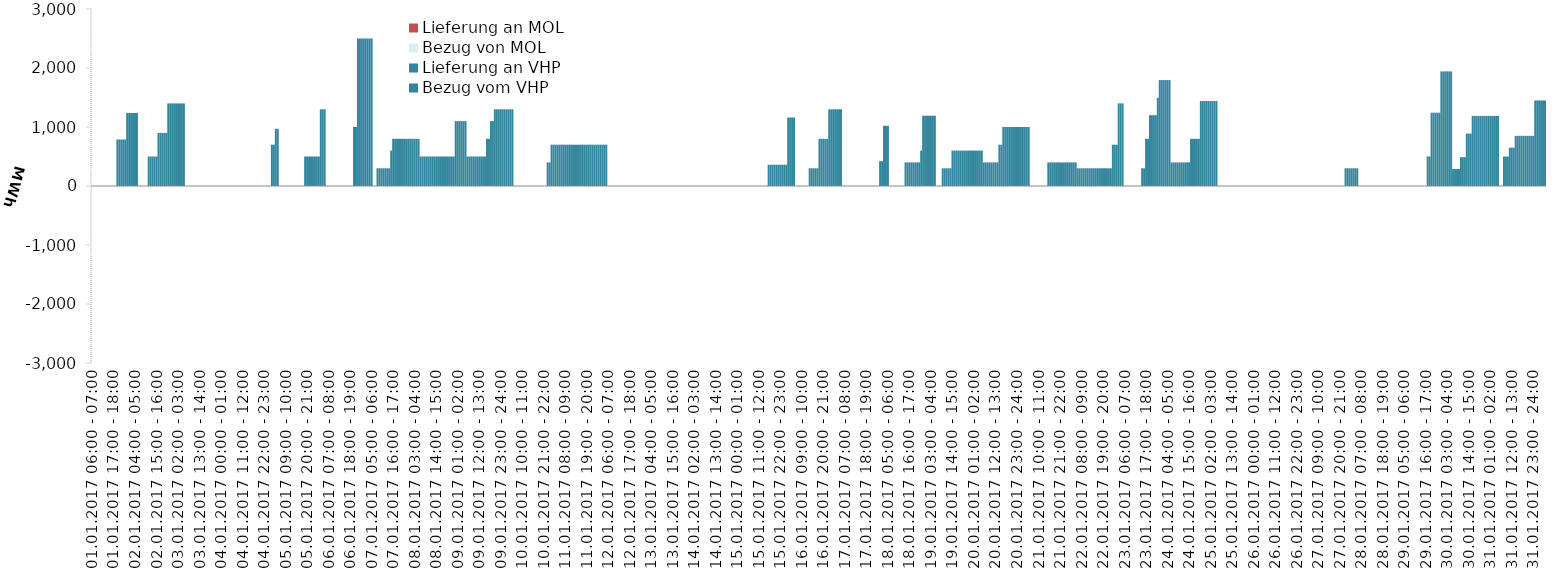
| Category | Bezug vom VHP | Lieferung an VHP | Bezug von MOL | Lieferung an MOL |
|---|---|---|---|---|
| 01.01.2017 06:00 - 07:00 | 0 | 0 | 0 | 0 |
| 01.01.2017 07:00 - 08:00 | 0 | 0 | 0 | 0 |
| 01.01.2017 08:00 - 09:00 | 0 | 0 | 0 | 0 |
| 01.01.2017 09:00 - 10:00 | 0 | 0 | 0 | 0 |
| 01.01.2017 10:00 - 11:00 | 0 | 0 | 0 | 0 |
| 01.01.2017 11:00 - 12:00 | 0 | 0 | 0 | 0 |
| 01.01.2017 12:00 - 13:00 | 0 | 0 | 0 | 0 |
| 01.01.2017 13:00 - 14:00 | 0 | 0 | 0 | 0 |
| 01.01.2017 14:00 - 15:00 | 0 | 0 | 0 | 0 |
| 01.01.2017 15:00 - 16:00 | 0 | 0 | 0 | 0 |
| 01.01.2017 16:00 - 17:00 | 0 | 0 | 0 | 0 |
| 01.01.2017 17:00 - 18:00 | 0 | 0 | 0 | 0 |
| 01.01.2017 18:00 - 19:00 | 0 | 0 | 0 | 0 |
| 01.01.2017 19:00 - 20:00 | 788 | 0 | 0 | 0 |
| 01.01.2017 20:00 - 21:00 | 788 | 0 | 0 | 0 |
| 01.01.2017 21:00 - 22:00 | 788 | 0 | 0 | 0 |
| 01.01.2017 22:00 - 23:00 | 788 | 0 | 0 | 0 |
| 01.01.2017 23:00 - 24:00 | 788 | 0 | 0 | 0 |
| 02.01.2017 00:00 - 01:00 | 1238 | 0 | 0 | 0 |
| 02.01.2017 01:00 - 02:00 | 1238 | 0 | 0 | 0 |
| 02.01.2017 02:00 - 03:00 | 1238 | 0 | 0 | 0 |
| 02.01.2017 03:00 - 04:00 | 1238 | 0 | 0 | 0 |
| 02.01.2017 04:00 - 05:00 | 1238 | 0 | 0 | 0 |
| 02.01.2017 05:00 - 06:00 | 1238 | 0 | 0 | 0 |
| 02.01.2017 06:00 - 07:00 | 0 | 0 | 0 | 0 |
| 02.01.2017 07:00 - 08:00 | 0 | 0 | 0 | 0 |
| 02.01.2017 08:00 - 09:00 | 0 | 0 | 0 | 0 |
| 02.01.2017 09:00 - 10:00 | 0 | 0 | 0 | 0 |
| 02.01.2017 10:00 - 11:00 | 0 | 0 | 0 | 0 |
| 02.01.2017 11:00 - 12:00 | 500 | 0 | 0 | 0 |
| 02.01.2017 12:00 - 13:00 | 500 | 0 | 0 | 0 |
| 02.01.2017 13:00 - 14:00 | 500 | 0 | 0 | 0 |
| 02.01.2017 14:00 - 15:00 | 500 | 0 | 0 | 0 |
| 02.01.2017 15:00 - 16:00 | 500 | 0 | 0 | 0 |
| 02.01.2017 16:00 - 17:00 | 900 | 0 | 0 | 0 |
| 02.01.2017 17:00 - 18:00 | 900 | 0 | 0 | 0 |
| 02.01.2017 18:00 - 19:00 | 900 | 0 | 0 | 0 |
| 02.01.2017 19:00 - 20:00 | 900 | 0 | 0 | 0 |
| 02.01.2017 20:00 - 21:00 | 900 | 0 | 0 | 0 |
| 02.01.2017 21:00 - 22:00 | 1400 | 0 | 0 | 0 |
| 02.01.2017 22:00 - 23:00 | 1400 | 0 | 0 | 0 |
| 02.01.2017 23:00 - 24:00 | 1400 | 0 | 0 | 0 |
| 03.01.2017 00:00 - 01:00 | 1400 | 0 | 0 | 0 |
| 03.01.2017 01:00 - 02:00 | 1400 | 0 | 0 | 0 |
| 03.01.2017 02:00 - 03:00 | 1400 | 0 | 0 | 0 |
| 03.01.2017 03:00 - 04:00 | 1400 | 0 | 0 | 0 |
| 03.01.2017 04:00 - 05:00 | 1400 | 0 | 0 | 0 |
| 03.01.2017 05:00 - 06:00 | 1400 | 0 | 0 | 0 |
| 03.01.2017 06:00 - 07:00 | 0 | 0 | 0 | 0 |
| 03.01.2017 07:00 - 08:00 | 0 | 0 | 0 | 0 |
| 03.01.2017 08:00 - 09:00 | 0 | 0 | 0 | 0 |
| 03.01.2017 09:00 - 10:00 | 0 | 0 | 0 | 0 |
| 03.01.2017 10:00 - 11:00 | 0 | 0 | 0 | 0 |
| 03.01.2017 11:00 - 12:00 | 0 | 0 | 0 | 0 |
| 03.01.2017 12:00 - 13:00 | 0 | 0 | 0 | 0 |
| 03.01.2017 13:00 - 14:00 | 0 | 0 | 0 | 0 |
| 03.01.2017 14:00 - 15:00 | 0 | 0 | 0 | 0 |
| 03.01.2017 15:00 - 16:00 | 0 | 0 | 0 | 0 |
| 03.01.2017 16:00 - 17:00 | 0 | 0 | 0 | 0 |
| 03.01.2017 17:00 - 18:00 | 0 | 0 | 0 | 0 |
| 03.01.2017 18:00 - 19:00 | 0 | 0 | 0 | 0 |
| 03.01.2017 19:00 - 20:00 | 0 | 0 | 0 | 0 |
| 03.01.2017 20:00 - 21:00 | 0 | 0 | 0 | 0 |
| 03.01.2017 21:00 - 22:00 | 0 | 0 | 0 | 0 |
| 03.01.2017 22:00 - 23:00 | 0 | 0 | 0 | 0 |
| 03.01.2017 23:00 - 24:00 | 0 | 0 | 0 | 0 |
| 04.01.2017 00:00 - 01:00 | 0 | 0 | 0 | 0 |
| 04.01.2017 01:00 - 02:00 | 0 | 0 | 0 | 0 |
| 04.01.2017 02:00 - 03:00 | 0 | 0 | 0 | 0 |
| 04.01.2017 03:00 - 04:00 | 0 | 0 | 0 | 0 |
| 04.01.2017 04:00 - 05:00 | 0 | 0 | 0 | 0 |
| 04.01.2017 05:00 - 06:00 | 0 | 0 | 0 | 0 |
| 04.01.2017 06:00 - 07:00 | 0 | 0 | 0 | 0 |
| 04.01.2017 07:00 - 08:00 | 0 | 0 | 0 | 0 |
| 04.01.2017 08:00 - 09:00 | 0 | 0 | 0 | 0 |
| 04.01.2017 09:00 - 10:00 | 0 | 0 | 0 | 0 |
| 04.01.2017 10:00 - 11:00 | 0 | 0 | 0 | 0 |
| 04.01.2017 11:00 - 12:00 | 0 | 0 | 0 | 0 |
| 04.01.2017 12:00 - 13:00 | 0 | 0 | 0 | 0 |
| 04.01.2017 13:00 - 14:00 | 0 | 0 | 0 | 0 |
| 04.01.2017 14:00 - 15:00 | 0 | 0 | 0 | 0 |
| 04.01.2017 15:00 - 16:00 | 0 | 0 | 0 | 0 |
| 04.01.2017 16:00 - 17:00 | 0 | 0 | 0 | 0 |
| 04.01.2017 17:00 - 18:00 | 0 | 0 | 0 | 0 |
| 04.01.2017 18:00 - 19:00 | 0 | 0 | 0 | 0 |
| 04.01.2017 19:00 - 20:00 | 0 | 0 | 0 | 0 |
| 04.01.2017 20:00 - 21:00 | 0 | 0 | 0 | 0 |
| 04.01.2017 21:00 - 22:00 | 0 | 0 | 0 | 0 |
| 04.01.2017 22:00 - 23:00 | 0 | 0 | 0 | 0 |
| 04.01.2017 23:00 - 24:00 | 0 | 0 | 0 | 0 |
| 05.01.2017 00:00 - 01:00 | 0 | 0 | 0 | 0 |
| 05.01.2017 01:00 - 02:00 | 0 | 0 | 0 | 0 |
| 05.01.2017 02:00 - 03:00 | 700 | 0 | 0 | 0 |
| 05.01.2017 03:00 - 04:00 | 700 | 0 | 0 | 0 |
| 05.01.2017 04:00 - 05:00 | 970 | 0 | 0 | 0 |
| 05.01.2017 05:00 - 06:00 | 970 | 0 | 0 | 0 |
| 05.01.2017 06:00 - 07:00 | 0 | 0 | 0 | 0 |
| 05.01.2017 07:00 - 08:00 | 0 | 0 | 0 | 0 |
| 05.01.2017 08:00 - 09:00 | 0 | 0 | 0 | 0 |
| 05.01.2017 09:00 - 10:00 | 0 | 0 | 0 | 0 |
| 05.01.2017 10:00 - 11:00 | 0 | 0 | 0 | 0 |
| 05.01.2017 11:00 - 12:00 | 0 | 0 | 0 | 0 |
| 05.01.2017 12:00 - 13:00 | 0 | 0 | 0 | 0 |
| 05.01.2017 13:00 - 14:00 | 0 | 0 | 0 | 0 |
| 05.01.2017 14:00 - 15:00 | 0 | 0 | 0 | 0 |
| 05.01.2017 15:00 - 16:00 | 0 | 0 | 0 | 0 |
| 05.01.2017 16:00 - 17:00 | 0 | 0 | 0 | 0 |
| 05.01.2017 17:00 - 18:00 | 0 | 0 | 0 | 0 |
| 05.01.2017 18:00 - 19:00 | 0 | 0 | 0 | 0 |
| 05.01.2017 19:00 - 20:00 | 500 | 0 | 0 | 0 |
| 05.01.2017 20:00 - 21:00 | 500 | 0 | 0 | 0 |
| 05.01.2017 21:00 - 22:00 | 500 | 0 | 0 | 0 |
| 05.01.2017 22:00 - 23:00 | 500 | 0 | 0 | 0 |
| 05.01.2017 23:00 - 24:00 | 500 | 0 | 0 | 0 |
| 06.01.2017 00:00 - 01:00 | 500 | 0 | 0 | 0 |
| 06.01.2017 01:00 - 02:00 | 500 | 0 | 0 | 0 |
| 06.01.2017 02:00 - 03:00 | 500 | 0 | 0 | 0 |
| 06.01.2017 03:00 - 04:00 | 1300 | 0 | 0 | 0 |
| 06.01.2017 04:00 - 05:00 | 1300 | 0 | 0 | 0 |
| 06.01.2017 05:00 - 06:00 | 1300 | 0 | 0 | 0 |
| 06.01.2017 06:00 - 07:00 | 0 | 0 | 0 | 0 |
| 06.01.2017 07:00 - 08:00 | 0 | 0 | 0 | 0 |
| 06.01.2017 08:00 - 09:00 | 0 | 0 | 0 | 0 |
| 06.01.2017 09:00 - 10:00 | 0 | 0 | 0 | 0 |
| 06.01.2017 10:00 - 11:00 | 0 | 0 | 0 | 0 |
| 06.01.2017 11:00 - 12:00 | 0 | 0 | 0 | 0 |
| 06.01.2017 12:00 - 13:00 | 0 | 0 | 0 | 0 |
| 06.01.2017 13:00 - 14:00 | 0 | 0 | 0 | 0 |
| 06.01.2017 14:00 - 15:00 | 0 | 0 | 0 | 0 |
| 06.01.2017 15:00 - 16:00 | 0 | 0 | 0 | 0 |
| 06.01.2017 16:00 - 17:00 | 0 | 0 | 0 | 0 |
| 06.01.2017 17:00 - 18:00 | 0 | 0 | 0 | 0 |
| 06.01.2017 18:00 - 19:00 | 0 | 0 | 0 | 0 |
| 06.01.2017 19:00 - 20:00 | 0 | 0 | 0 | 0 |
| 06.01.2017 20:00 - 21:00 | 1000 | 0 | 0 | 0 |
| 06.01.2017 21:00 - 22:00 | 1000 | 0 | 0 | 0 |
| 06.01.2017 22:00 - 23:00 | 2500 | 0 | 0 | 0 |
| 06.01.2017 23:00 - 24:00 | 2500 | 0 | 0 | 0 |
| 07.01.2017 00:00 - 01:00 | 2500 | 0 | 0 | 0 |
| 07.01.2017 01:00 - 02:00 | 2500 | 0 | 0 | 0 |
| 07.01.2017 02:00 - 03:00 | 2500 | 0 | 0 | 0 |
| 07.01.2017 03:00 - 04:00 | 2500 | 0 | 0 | 0 |
| 07.01.2017 04:00 - 05:00 | 2500 | 0 | 0 | 0 |
| 07.01.2017 05:00 - 06:00 | 2500 | 0 | 0 | 0 |
| 07.01.2017 06:00 - 07:00 | 0 | 0 | 0 | 0 |
| 07.01.2017 07:00 - 08:00 | 0 | 0 | 0 | 0 |
| 07.01.2017 08:00 - 09:00 | 300 | 0 | 0 | 0 |
| 07.01.2017 09:00 - 10:00 | 300 | 0 | 0 | 0 |
| 07.01.2017 10:00 - 11:00 | 300 | 0 | 0 | 0 |
| 07.01.2017 11:00 - 12:00 | 300 | 0 | 0 | 0 |
| 07.01.2017 12:00 - 13:00 | 300 | 0 | 0 | 0 |
| 07.01.2017 13:00 - 14:00 | 300 | 0 | 0 | 0 |
| 07.01.2017 14:00 - 15:00 | 300 | 0 | 0 | 0 |
| 07.01.2017 15:00 - 16:00 | 600 | 0 | 0 | 0 |
| 07.01.2017 16:00 - 17:00 | 800 | 0 | 0 | 0 |
| 07.01.2017 17:00 - 18:00 | 800 | 0 | 0 | 0 |
| 07.01.2017 18:00 - 19:00 | 800 | 0 | 0 | 0 |
| 07.01.2017 19:00 - 20:00 | 800 | 0 | 0 | 0 |
| 07.01.2017 20:00 - 21:00 | 800 | 0 | 0 | 0 |
| 07.01.2017 21:00 - 22:00 | 800 | 0 | 0 | 0 |
| 07.01.2017 22:00 - 23:00 | 800 | 0 | 0 | 0 |
| 07.01.2017 23:00 - 24:00 | 800 | 0 | 0 | 0 |
| 08.01.2017 00:00 - 01:00 | 800 | 0 | 0 | 0 |
| 08.01.2017 01:00 - 02:00 | 800 | 0 | 0 | 0 |
| 08.01.2017 02:00 - 03:00 | 800 | 0 | 0 | 0 |
| 08.01.2017 03:00 - 04:00 | 800 | 0 | 0 | 0 |
| 08.01.2017 04:00 - 05:00 | 800 | 0 | 0 | 0 |
| 08.01.2017 05:00 - 06:00 | 800 | 0 | 0 | 0 |
| 08.01.2017 06:00 - 07:00 | 500 | 0 | 0 | 0 |
| 08.01.2017 07:00 - 08:00 | 500 | 0 | 0 | 0 |
| 08.01.2017 08:00 - 09:00 | 500 | 0 | 0 | 0 |
| 08.01.2017 09:00 - 10:00 | 500 | 0 | 0 | 0 |
| 08.01.2017 10:00 - 11:00 | 500 | 0 | 0 | 0 |
| 08.01.2017 11:00 - 12:00 | 500 | 0 | 0 | 0 |
| 08.01.2017 12:00 - 13:00 | 500 | 0 | 0 | 0 |
| 08.01.2017 13:00 - 14:00 | 500 | 0 | 0 | 0 |
| 08.01.2017 14:00 - 15:00 | 500 | 0 | 0 | 0 |
| 08.01.2017 15:00 - 16:00 | 500 | 0 | 0 | 0 |
| 08.01.2017 16:00 - 17:00 | 500 | 0 | 0 | 0 |
| 08.01.2017 17:00 - 18:00 | 500 | 0 | 0 | 0 |
| 08.01.2017 18:00 - 19:00 | 500 | 0 | 0 | 0 |
| 08.01.2017 19:00 - 20:00 | 500 | 0 | 0 | 0 |
| 08.01.2017 20:00 - 21:00 | 500 | 0 | 0 | 0 |
| 08.01.2017 21:00 - 22:00 | 500 | 0 | 0 | 0 |
| 08.01.2017 22:00 - 23:00 | 500 | 0 | 0 | 0 |
| 08.01.2017 23:00 - 24:00 | 500 | 0 | 0 | 0 |
| 09.01.2017 00:00 - 01:00 | 1100 | 0 | 0 | 0 |
| 09.01.2017 01:00 - 02:00 | 1100 | 0 | 0 | 0 |
| 09.01.2017 02:00 - 03:00 | 1100 | 0 | 0 | 0 |
| 09.01.2017 03:00 - 04:00 | 1100 | 0 | 0 | 0 |
| 09.01.2017 04:00 - 05:00 | 1100 | 0 | 0 | 0 |
| 09.01.2017 05:00 - 06:00 | 1100 | 0 | 0 | 0 |
| 09.01.2017 06:00 - 07:00 | 500 | 0 | 0 | 0 |
| 09.01.2017 07:00 - 08:00 | 500 | 0 | 0 | 0 |
| 09.01.2017 08:00 - 09:00 | 500 | 0 | 0 | 0 |
| 09.01.2017 09:00 - 10:00 | 500 | 0 | 0 | 0 |
| 09.01.2017 10:00 - 11:00 | 500 | 0 | 0 | 0 |
| 09.01.2017 11:00 - 12:00 | 500 | 0 | 0 | 0 |
| 09.01.2017 12:00 - 13:00 | 500 | 0 | 0 | 0 |
| 09.01.2017 13:00 - 14:00 | 500 | 0 | 0 | 0 |
| 09.01.2017 14:00 - 15:00 | 500 | 0 | 0 | 0 |
| 09.01.2017 15:00 - 16:00 | 500 | 0 | 0 | 0 |
| 09.01.2017 16:00 - 17:00 | 800 | 0 | 0 | 0 |
| 09.01.2017 17:00 - 18:00 | 800 | 0 | 0 | 0 |
| 09.01.2017 18:00 - 19:00 | 1100 | 0 | 0 | 0 |
| 09.01.2017 19:00 - 20:00 | 1100 | 0 | 0 | 0 |
| 09.01.2017 20:00 - 21:00 | 1300 | 0 | 0 | 0 |
| 09.01.2017 21:00 - 22:00 | 1300 | 0 | 0 | 0 |
| 09.01.2017 22:00 - 23:00 | 1300 | 0 | 0 | 0 |
| 09.01.2017 23:00 - 24:00 | 1300 | 0 | 0 | 0 |
| 10.01.2017 00:00 - 01:00 | 1300 | 0 | 0 | 0 |
| 10.01.2017 01:00 - 02:00 | 1300 | 0 | 0 | 0 |
| 10.01.2017 02:00 - 03:00 | 1300 | 0 | 0 | 0 |
| 10.01.2017 03:00 - 04:00 | 1300 | 0 | 0 | 0 |
| 10.01.2017 04:00 - 05:00 | 1300 | 0 | 0 | 0 |
| 10.01.2017 05:00 - 06:00 | 1300 | 0 | 0 | 0 |
| 10.01.2017 06:00 - 07:00 | 0 | 0 | 0 | 0 |
| 10.01.2017 07:00 - 08:00 | 0 | 0 | 0 | 0 |
| 10.01.2017 08:00 - 09:00 | 0 | 0 | 0 | 0 |
| 10.01.2017 09:00 - 10:00 | 0 | 0 | 0 | 0 |
| 10.01.2017 10:00 - 11:00 | 0 | 0 | 0 | 0 |
| 10.01.2017 11:00 - 12:00 | 0 | 0 | 0 | 0 |
| 10.01.2017 12:00 - 13:00 | 0 | 0 | 0 | 0 |
| 10.01.2017 13:00 - 14:00 | 0 | 0 | 0 | 0 |
| 10.01.2017 14:00 - 15:00 | 0 | 0 | 0 | 0 |
| 10.01.2017 15:00 - 16:00 | 0 | 0 | 0 | 0 |
| 10.01.2017 16:00 - 17:00 | 0 | 0 | 0 | 0 |
| 10.01.2017 17:00 - 18:00 | 0 | 0 | 0 | 0 |
| 10.01.2017 18:00 - 19:00 | 0 | 0 | 0 | 0 |
| 10.01.2017 19:00 - 20:00 | 0 | 0 | 0 | 0 |
| 10.01.2017 20:00 - 21:00 | 0 | 0 | 0 | 0 |
| 10.01.2017 21:00 - 22:00 | 0 | 0 | 0 | 0 |
| 10.01.2017 22:00 - 23:00 | 0 | 0 | 0 | 0 |
| 10.01.2017 23:00 - 24:00 | 400 | 0 | 0 | 0 |
| 11.01.2017 00:00 - 01:00 | 400 | 0 | 0 | 0 |
| 11.01.2017 01:00 - 02:00 | 700 | 0 | 0 | 0 |
| 11.01.2017 02:00 - 03:00 | 700 | 0 | 0 | 0 |
| 11.01.2017 03:00 - 04:00 | 700 | 0 | 0 | 0 |
| 11.01.2017 04:00 - 05:00 | 700 | 0 | 0 | 0 |
| 11.01.2017 05:00 - 06:00 | 700 | 0 | 0 | 0 |
| 11.01.2017 06:00 - 07:00 | 700 | 0 | 0 | 0 |
| 11.01.2017 07:00 - 08:00 | 700 | 0 | 0 | 0 |
| 11.01.2017 08:00 - 09:00 | 700 | 0 | 0 | 0 |
| 11.01.2017 09:00 - 10:00 | 700 | 0 | 0 | 0 |
| 11.01.2017 10:00 - 11:00 | 700 | 0 | 0 | 0 |
| 11.01.2017 11:00 - 12:00 | 700 | 0 | 0 | 0 |
| 11.01.2017 12:00 - 13:00 | 700 | 0 | 0 | 0 |
| 11.01.2017 13:00 - 14:00 | 700 | 0 | 0 | 0 |
| 11.01.2017 14:00 - 15:00 | 700 | 0 | 0 | 0 |
| 11.01.2017 15:00 - 16:00 | 700 | 0 | 0 | 0 |
| 11.01.2017 16:00 - 17:00 | 700 | 0 | 0 | 0 |
| 11.01.2017 17:00 - 18:00 | 700 | 0 | 0 | 0 |
| 11.01.2017 18:00 - 19:00 | 700 | 0 | 0 | 0 |
| 11.01.2017 19:00 - 20:00 | 700 | 0 | 0 | 0 |
| 11.01.2017 20:00 - 21:00 | 700 | 0 | 0 | 0 |
| 11.01.2017 21:00 - 22:00 | 700 | 0 | 0 | 0 |
| 11.01.2017 22:00 - 23:00 | 700 | 0 | 0 | 0 |
| 11.01.2017 23:00 - 24:00 | 700 | 0 | 0 | 0 |
| 12.01.2017 00:00 - 01:00 | 700 | 0 | 0 | 0 |
| 12.01.2017 01:00 - 02:00 | 700 | 0 | 0 | 0 |
| 12.01.2017 02:00 - 03:00 | 700 | 0 | 0 | 0 |
| 12.01.2017 03:00 - 04:00 | 700 | 0 | 0 | 0 |
| 12.01.2017 04:00 - 05:00 | 700 | 0 | 0 | 0 |
| 12.01.2017 05:00 - 06:00 | 700 | 0 | 0 | 0 |
| 12.01.2017 06:00 - 07:00 | 0 | 0 | 0 | 0 |
| 12.01.2017 07:00 - 08:00 | 0 | 0 | 0 | 0 |
| 12.01.2017 08:00 - 09:00 | 0 | 0 | 0 | 0 |
| 12.01.2017 09:00 - 10:00 | 0 | 0 | 0 | 0 |
| 12.01.2017 10:00 - 11:00 | 0 | 0 | 0 | 0 |
| 12.01.2017 11:00 - 12:00 | 0 | 0 | 0 | 0 |
| 12.01.2017 12:00 - 13:00 | 0 | 0 | 0 | 0 |
| 12.01.2017 13:00 - 14:00 | 0 | 0 | 0 | 0 |
| 12.01.2017 14:00 - 15:00 | 0 | 0 | 0 | 0 |
| 12.01.2017 15:00 - 16:00 | 0 | 0 | 0 | 0 |
| 12.01.2017 16:00 - 17:00 | 0 | 0 | 0 | 0 |
| 12.01.2017 17:00 - 18:00 | 0 | 0 | 0 | 0 |
| 12.01.2017 18:00 - 19:00 | 0 | 0 | 0 | 0 |
| 12.01.2017 19:00 - 20:00 | 0 | 0 | 0 | 0 |
| 12.01.2017 20:00 - 21:00 | 0 | 0 | 0 | 0 |
| 12.01.2017 21:00 - 22:00 | 0 | 0 | 0 | 0 |
| 12.01.2017 22:00 - 23:00 | 0 | 0 | 0 | 0 |
| 12.01.2017 23:00 - 24:00 | 0 | 0 | 0 | 0 |
| 13.01.2017 00:00 - 01:00 | 0 | 0 | 0 | 0 |
| 13.01.2017 01:00 - 02:00 | 0 | 0 | 0 | 0 |
| 13.01.2017 02:00 - 03:00 | 0 | 0 | 0 | 0 |
| 13.01.2017 03:00 - 04:00 | 0 | 0 | 0 | 0 |
| 13.01.2017 04:00 - 05:00 | 0 | 0 | 0 | 0 |
| 13.01.2017 05:00 - 06:00 | 0 | 0 | 0 | 0 |
| 13.01.2017 06:00 - 07:00 | 0 | 0 | 0 | 0 |
| 13.01.2017 07:00 - 08:00 | 0 | 0 | 0 | 0 |
| 13.01.2017 08:00 - 09:00 | 0 | 0 | 0 | 0 |
| 13.01.2017 09:00 - 10:00 | 0 | 0 | 0 | 0 |
| 13.01.2017 10:00 - 11:00 | 0 | 0 | 0 | 0 |
| 13.01.2017 11:00 - 12:00 | 0 | 0 | 0 | 0 |
| 13.01.2017 12:00 - 13:00 | 0 | 0 | 0 | 0 |
| 13.01.2017 13:00 - 14:00 | 0 | 0 | 0 | 0 |
| 13.01.2017 14:00 - 15:00 | 0 | 0 | 0 | 0 |
| 13.01.2017 15:00 - 16:00 | 0 | 0 | 0 | 0 |
| 13.01.2017 16:00 - 17:00 | 0 | 0 | 0 | 0 |
| 13.01.2017 17:00 - 18:00 | 0 | 0 | 0 | 0 |
| 13.01.2017 18:00 - 19:00 | 0 | 0 | 0 | 0 |
| 13.01.2017 19:00 - 20:00 | 0 | 0 | 0 | 0 |
| 13.01.2017 20:00 - 21:00 | 0 | 0 | 0 | 0 |
| 13.01.2017 21:00 - 22:00 | 0 | 0 | 0 | 0 |
| 13.01.2017 22:00 - 23:00 | 0 | 0 | 0 | 0 |
| 13.01.2017 23:00 - 24:00 | 0 | 0 | 0 | 0 |
| 14.01.2017 00:00 - 01:00 | 0 | 0 | 0 | 0 |
| 14.01.2017 01:00 - 02:00 | 0 | 0 | 0 | 0 |
| 14.01.2017 02:00 - 03:00 | 0 | 0 | 0 | 0 |
| 14.01.2017 03:00 - 04:00 | 0 | 0 | 0 | 0 |
| 14.01.2017 04:00 - 05:00 | 0 | 0 | 0 | 0 |
| 14.01.2017 05:00 - 06:00 | 0 | 0 | 0 | 0 |
| 14.01.2017 06:00 - 07:00 | 0 | 0 | 0 | 0 |
| 14.01.2017 07:00 - 08:00 | 0 | 0 | 0 | 0 |
| 14.01.2017 08:00 - 09:00 | 0 | 0 | 0 | 0 |
| 14.01.2017 09:00 - 10:00 | 0 | 0 | 0 | 0 |
| 14.01.2017 10:00 - 11:00 | 0 | 0 | 0 | 0 |
| 14.01.2017 11:00 - 12:00 | 0 | 0 | 0 | 0 |
| 14.01.2017 12:00 - 13:00 | 0 | 0 | 0 | 0 |
| 14.01.2017 13:00 - 14:00 | 0 | 0 | 0 | 0 |
| 14.01.2017 14:00 - 15:00 | 0 | 0 | 0 | 0 |
| 14.01.2017 15:00 - 16:00 | 0 | 0 | 0 | 0 |
| 14.01.2017 16:00 - 17:00 | 0 | 0 | 0 | 0 |
| 14.01.2017 17:00 - 18:00 | 0 | 0 | 0 | 0 |
| 14.01.2017 18:00 - 19:00 | 0 | 0 | 0 | 0 |
| 14.01.2017 19:00 - 20:00 | 0 | 0 | 0 | 0 |
| 14.01.2017 20:00 - 21:00 | 0 | 0 | 0 | 0 |
| 14.01.2017 21:00 - 22:00 | 0 | 0 | 0 | 0 |
| 14.01.2017 22:00 - 23:00 | 0 | 0 | 0 | 0 |
| 14.01.2017 23:00 - 24:00 | 0 | 0 | 0 | 0 |
| 15.01.2017 00:00 - 01:00 | 0 | 0 | 0 | 0 |
| 15.01.2017 01:00 - 02:00 | 0 | 0 | 0 | 0 |
| 15.01.2017 02:00 - 03:00 | 0 | 0 | 0 | 0 |
| 15.01.2017 03:00 - 04:00 | 0 | 0 | 0 | 0 |
| 15.01.2017 04:00 - 05:00 | 0 | 0 | 0 | 0 |
| 15.01.2017 05:00 - 06:00 | 0 | 0 | 0 | 0 |
| 15.01.2017 06:00 - 07:00 | 0 | 0 | 0 | 0 |
| 15.01.2017 07:00 - 08:00 | 0 | 0 | 0 | 0 |
| 15.01.2017 08:00 - 09:00 | 0 | 0 | 0 | 0 |
| 15.01.2017 09:00 - 10:00 | 0 | 0 | 0 | 0 |
| 15.01.2017 10:00 - 11:00 | 0 | 0 | 0 | 0 |
| 15.01.2017 11:00 - 12:00 | 0 | 0 | 0 | 0 |
| 15.01.2017 12:00 - 13:00 | 0 | 0 | 0 | 0 |
| 15.01.2017 13:00 - 14:00 | 0 | 0 | 0 | 0 |
| 15.01.2017 14:00 - 15:00 | 0 | 0 | 0 | 0 |
| 15.01.2017 15:00 - 16:00 | 0 | 0 | 0 | 0 |
| 15.01.2017 16:00 - 17:00 | 360 | 0 | 0 | 0 |
| 15.01.2017 17:00 - 18:00 | 360 | 0 | 0 | 0 |
| 15.01.2017 18:00 - 19:00 | 360 | 0 | 0 | 0 |
| 15.01.2017 19:00 - 20:00 | 360 | 0 | 0 | 0 |
| 15.01.2017 20:00 - 21:00 | 360 | 0 | 0 | 0 |
| 15.01.2017 21:00 - 22:00 | 360 | 0 | 0 | 0 |
| 15.01.2017 22:00 - 23:00 | 360 | 0 | 0 | 0 |
| 15.01.2017 23:00 - 24:00 | 360 | 0 | 0 | 0 |
| 16.01.2017 00:00 - 01:00 | 360 | 0 | 0 | 0 |
| 16.01.2017 01:00 - 02:00 | 360 | 0 | 0 | 0 |
| 16.01.2017 02:00 - 03:00 | 1160 | 0 | 0 | 0 |
| 16.01.2017 03:00 - 04:00 | 1160 | 0 | 0 | 0 |
| 16.01.2017 04:00 - 05:00 | 1160 | 0 | 0 | 0 |
| 16.01.2017 05:00 - 06:00 | 1160 | 0 | 0 | 0 |
| 16.01.2017 06:00 - 07:00 | 0 | 0 | 0 | 0 |
| 16.01.2017 07:00 - 08:00 | 0 | 0 | 0 | 0 |
| 16.01.2017 08:00 - 09:00 | 0 | 0 | 0 | 0 |
| 16.01.2017 09:00 - 10:00 | 0 | 0 | 0 | 0 |
| 16.01.2017 10:00 - 11:00 | 0 | 0 | 0 | 0 |
| 16.01.2017 11:00 - 12:00 | 0 | 0 | 0 | 0 |
| 16.01.2017 12:00 - 13:00 | 0 | 0 | 0 | 0 |
| 16.01.2017 13:00 - 14:00 | 300 | 0 | 0 | 0 |
| 16.01.2017 14:00 - 15:00 | 300 | 0 | 0 | 0 |
| 16.01.2017 15:00 - 16:00 | 300 | 0 | 0 | 0 |
| 16.01.2017 16:00 - 17:00 | 300 | 0 | 0 | 0 |
| 16.01.2017 17:00 - 18:00 | 300 | 0 | 0 | 0 |
| 16.01.2017 18:00 - 19:00 | 800 | 0 | 0 | 0 |
| 16.01.2017 19:00 - 20:00 | 800 | 0 | 0 | 0 |
| 16.01.2017 20:00 - 21:00 | 800 | 0 | 0 | 0 |
| 16.01.2017 21:00 - 22:00 | 800 | 0 | 0 | 0 |
| 16.01.2017 22:00 - 23:00 | 800 | 0 | 0 | 0 |
| 16.01.2017 23:00 - 24:00 | 1300 | 0 | 0 | 0 |
| 17.01.2017 00:00 - 01:00 | 1300 | 0 | 0 | 0 |
| 17.01.2017 01:00 - 02:00 | 1300 | 0 | 0 | 0 |
| 17.01.2017 02:00 - 03:00 | 1300 | 0 | 0 | 0 |
| 17.01.2017 03:00 - 04:00 | 1300 | 0 | 0 | 0 |
| 17.01.2017 04:00 - 05:00 | 1300 | 0 | 0 | 0 |
| 17.01.2017 05:00 - 06:00 | 1300 | 0 | 0 | 0 |
| 17.01.2017 06:00 - 07:00 | 0 | 0 | 0 | 0 |
| 17.01.2017 07:00 - 08:00 | 0 | 0 | 0 | 0 |
| 17.01.2017 08:00 - 09:00 | 0 | 0 | 0 | 0 |
| 17.01.2017 09:00 - 10:00 | 0 | 0 | 0 | 0 |
| 17.01.2017 10:00 - 11:00 | 0 | 0 | 0 | 0 |
| 17.01.2017 11:00 - 12:00 | 0 | 0 | 0 | 0 |
| 17.01.2017 12:00 - 13:00 | 0 | 0 | 0 | 0 |
| 17.01.2017 13:00 - 14:00 | 0 | 0 | 0 | 0 |
| 17.01.2017 14:00 - 15:00 | 0 | 0 | 0 | 0 |
| 17.01.2017 15:00 - 16:00 | 0 | 0 | 0 | 0 |
| 17.01.2017 16:00 - 17:00 | 0 | 0 | 0 | 0 |
| 17.01.2017 17:00 - 18:00 | 0 | 0 | 0 | 0 |
| 17.01.2017 18:00 - 19:00 | 0 | 0 | 0 | 0 |
| 17.01.2017 19:00 - 20:00 | 0 | 0 | 0 | 0 |
| 17.01.2017 20:00 - 21:00 | 0 | 0 | 0 | 0 |
| 17.01.2017 21:00 - 22:00 | 0 | 0 | 0 | 0 |
| 17.01.2017 22:00 - 23:00 | 0 | 0 | 0 | 0 |
| 17.01.2017 23:00 - 24:00 | 0 | 0 | 0 | 0 |
| 18.01.2017 00:00 - 01:00 | 0 | 0 | 0 | 0 |
| 18.01.2017 01:00 - 02:00 | 420 | 0 | 0 | 0 |
| 18.01.2017 02:00 - 03:00 | 420 | 0 | 0 | 0 |
| 18.01.2017 03:00 - 04:00 | 1020 | 0 | 0 | 0 |
| 18.01.2017 04:00 - 05:00 | 1020 | 0 | 0 | 0 |
| 18.01.2017 05:00 - 06:00 | 1020 | 0 | 0 | 0 |
| 18.01.2017 06:00 - 07:00 | 0 | 0 | 0 | 0 |
| 18.01.2017 07:00 - 08:00 | 0 | 0 | 0 | 0 |
| 18.01.2017 08:00 - 09:00 | 0 | 0 | 0 | 0 |
| 18.01.2017 09:00 - 10:00 | 0 | 0 | 0 | 0 |
| 18.01.2017 10:00 - 11:00 | 0 | 0 | 0 | 0 |
| 18.01.2017 11:00 - 12:00 | 0 | 0 | 0 | 0 |
| 18.01.2017 12:00 - 13:00 | 0 | 0 | 0 | 0 |
| 18.01.2017 13:00 - 14:00 | 0 | 0 | 0 | 0 |
| 18.01.2017 14:00 - 15:00 | 400 | 0 | 0 | 0 |
| 18.01.2017 15:00 - 16:00 | 400 | 0 | 0 | 0 |
| 18.01.2017 16:00 - 17:00 | 400 | 0 | 0 | 0 |
| 18.01.2017 17:00 - 18:00 | 400 | 0 | 0 | 0 |
| 18.01.2017 18:00 - 19:00 | 400 | 0 | 0 | 0 |
| 18.01.2017 19:00 - 20:00 | 400 | 0 | 0 | 0 |
| 18.01.2017 20:00 - 21:00 | 400 | 0 | 0 | 0 |
| 18.01.2017 21:00 - 22:00 | 400 | 0 | 0 | 0 |
| 18.01.2017 22:00 - 23:00 | 600 | 0 | 0 | 0 |
| 18.01.2017 23:00 - 24:00 | 1191 | 0 | 0 | 0 |
| 19.01.2017 00:00 - 01:00 | 1191 | 0 | 0 | 0 |
| 19.01.2017 01:00 - 02:00 | 1191 | 0 | 0 | 0 |
| 19.01.2017 02:00 - 03:00 | 1191 | 0 | 0 | 0 |
| 19.01.2017 03:00 - 04:00 | 1191 | 0 | 0 | 0 |
| 19.01.2017 04:00 - 05:00 | 1191 | 0 | 0 | 0 |
| 19.01.2017 05:00 - 06:00 | 1191 | 0 | 0 | 0 |
| 19.01.2017 06:00 - 07:00 | 0 | 0 | 0 | 0 |
| 19.01.2017 07:00 - 08:00 | 0 | 0 | 0 | 0 |
| 19.01.2017 08:00 - 09:00 | 0 | 0 | 0 | 0 |
| 19.01.2017 09:00 - 10:00 | 300 | 0 | 0 | 0 |
| 19.01.2017 10:00 - 11:00 | 300 | 0 | 0 | 0 |
| 19.01.2017 11:00 - 12:00 | 300 | 0 | 0 | 0 |
| 19.01.2017 12:00 - 13:00 | 300 | 0 | 0 | 0 |
| 19.01.2017 13:00 - 14:00 | 300 | 0 | 0 | 0 |
| 19.01.2017 14:00 - 15:00 | 600 | 0 | 0 | 0 |
| 19.01.2017 15:00 - 16:00 | 600 | 0 | 0 | 0 |
| 19.01.2017 16:00 - 17:00 | 600 | 0 | 0 | 0 |
| 19.01.2017 17:00 - 18:00 | 600 | 0 | 0 | 0 |
| 19.01.2017 18:00 - 19:00 | 600 | 0 | 0 | 0 |
| 19.01.2017 19:00 - 20:00 | 600 | 0 | 0 | 0 |
| 19.01.2017 20:00 - 21:00 | 600 | 0 | 0 | 0 |
| 19.01.2017 21:00 - 22:00 | 600 | 0 | 0 | 0 |
| 19.01.2017 22:00 - 23:00 | 600 | 0 | 0 | 0 |
| 19.01.2017 23:00 - 24:00 | 600 | 0 | 0 | 0 |
| 20.01.2017 00:00 - 01:00 | 600 | 0 | 0 | 0 |
| 20.01.2017 01:00 - 02:00 | 600 | 0 | 0 | 0 |
| 20.01.2017 02:00 - 03:00 | 600 | 0 | 0 | 0 |
| 20.01.2017 03:00 - 04:00 | 600 | 0 | 0 | 0 |
| 20.01.2017 04:00 - 05:00 | 600 | 0 | 0 | 0 |
| 20.01.2017 05:00 - 06:00 | 600 | 0 | 0 | 0 |
| 20.01.2017 06:00 - 07:00 | 400 | 0 | 0 | 0 |
| 20.01.2017 07:00 - 08:00 | 400 | 0 | 0 | 0 |
| 20.01.2017 08:00 - 09:00 | 400 | 0 | 0 | 0 |
| 20.01.2017 09:00 - 10:00 | 400 | 0 | 0 | 0 |
| 20.01.2017 10:00 - 11:00 | 400 | 0 | 0 | 0 |
| 20.01.2017 11:00 - 12:00 | 400 | 0 | 0 | 0 |
| 20.01.2017 12:00 - 13:00 | 400 | 0 | 0 | 0 |
| 20.01.2017 13:00 - 14:00 | 400 | 0 | 0 | 0 |
| 20.01.2017 14:00 - 15:00 | 700 | 0 | 0 | 0 |
| 20.01.2017 15:00 - 16:00 | 700 | 0 | 0 | 0 |
| 20.01.2017 16:00 - 17:00 | 1000 | 0 | 0 | 0 |
| 20.01.2017 17:00 - 18:00 | 1000 | 0 | 0 | 0 |
| 20.01.2017 18:00 - 19:00 | 1000 | 0 | 0 | 0 |
| 20.01.2017 19:00 - 20:00 | 1000 | 0 | 0 | 0 |
| 20.01.2017 20:00 - 21:00 | 1000 | 0 | 0 | 0 |
| 20.01.2017 21:00 - 22:00 | 1000 | 0 | 0 | 0 |
| 20.01.2017 22:00 - 23:00 | 1000 | 0 | 0 | 0 |
| 20.01.2017 23:00 - 24:00 | 1000 | 0 | 0 | 0 |
| 21.01.2017 00:00 - 01:00 | 1000 | 0 | 0 | 0 |
| 21.01.2017 01:00 - 02:00 | 1000 | 0 | 0 | 0 |
| 21.01.2017 02:00 - 03:00 | 1000 | 0 | 0 | 0 |
| 21.01.2017 03:00 - 04:00 | 1000 | 0 | 0 | 0 |
| 21.01.2017 04:00 - 05:00 | 1000 | 0 | 0 | 0 |
| 21.01.2017 05:00 - 06:00 | 1000 | 0 | 0 | 0 |
| 21.01.2017 06:00 - 07:00 | 0 | 0 | 0 | 0 |
| 21.01.2017 07:00 - 08:00 | 0 | 0 | 0 | 0 |
| 21.01.2017 08:00 - 09:00 | 0 | 0 | 0 | 0 |
| 21.01.2017 09:00 - 10:00 | 0 | 0 | 0 | 0 |
| 21.01.2017 10:00 - 11:00 | 0 | 0 | 0 | 0 |
| 21.01.2017 11:00 - 12:00 | 0 | 0 | 0 | 0 |
| 21.01.2017 12:00 - 13:00 | 0 | 0 | 0 | 0 |
| 21.01.2017 13:00 - 14:00 | 0 | 0 | 0 | 0 |
| 21.01.2017 14:00 - 15:00 | 0 | 0 | 0 | 0 |
| 21.01.2017 15:00 - 16:00 | 400 | 0 | 0 | 0 |
| 21.01.2017 16:00 - 17:00 | 400 | 0 | 0 | 0 |
| 21.01.2017 17:00 - 18:00 | 400 | 0 | 0 | 0 |
| 21.01.2017 18:00 - 19:00 | 400 | 0 | 0 | 0 |
| 21.01.2017 19:00 - 20:00 | 400 | 0 | 0 | 0 |
| 21.01.2017 20:00 - 21:00 | 400 | 0 | 0 | 0 |
| 21.01.2017 21:00 - 22:00 | 400 | 0 | 0 | 0 |
| 21.01.2017 22:00 - 23:00 | 400 | 0 | 0 | 0 |
| 21.01.2017 23:00 - 24:00 | 400 | 0 | 0 | 0 |
| 22.01.2017 00:00 - 01:00 | 400 | 0 | 0 | 0 |
| 22.01.2017 01:00 - 02:00 | 400 | 0 | 0 | 0 |
| 22.01.2017 02:00 - 03:00 | 400 | 0 | 0 | 0 |
| 22.01.2017 03:00 - 04:00 | 400 | 0 | 0 | 0 |
| 22.01.2017 04:00 - 05:00 | 400 | 0 | 0 | 0 |
| 22.01.2017 05:00 - 06:00 | 400 | 0 | 0 | 0 |
| 22.01.2017 06:00 - 07:00 | 300 | 0 | 0 | 0 |
| 22.01.2017 07:00 - 08:00 | 300 | 0 | 0 | 0 |
| 22.01.2017 08:00 - 09:00 | 300 | 0 | 0 | 0 |
| 22.01.2017 09:00 - 10:00 | 300 | 0 | 0 | 0 |
| 22.01.2017 10:00 - 11:00 | 300 | 0 | 0 | 0 |
| 22.01.2017 11:00 - 12:00 | 300 | 0 | 0 | 0 |
| 22.01.2017 12:00 - 13:00 | 300 | 0 | 0 | 0 |
| 22.01.2017 13:00 - 14:00 | 300 | 0 | 0 | 0 |
| 22.01.2017 14:00 - 15:00 | 300 | 0 | 0 | 0 |
| 22.01.2017 15:00 - 16:00 | 300 | 0 | 0 | 0 |
| 22.01.2017 16:00 - 17:00 | 300 | 0 | 0 | 0 |
| 22.01.2017 17:00 - 18:00 | 300 | 0 | 0 | 0 |
| 22.01.2017 18:00 - 19:00 | 300 | 0 | 0 | 0 |
| 22.01.2017 19:00 - 20:00 | 300 | 0 | 0 | 0 |
| 22.01.2017 20:00 - 21:00 | 300 | 0 | 0 | 0 |
| 22.01.2017 21:00 - 22:00 | 300 | 0 | 0 | 0 |
| 22.01.2017 22:00 - 23:00 | 300 | 0 | 0 | 0 |
| 22.01.2017 23:00 - 24:00 | 300 | 0 | 0 | 0 |
| 23.01.2017 00:00 - 01:00 | 700 | 0 | 0 | 0 |
| 23.01.2017 01:00 - 02:00 | 700 | 0 | 0 | 0 |
| 23.01.2017 02:00 - 03:00 | 700 | 0 | 0 | 0 |
| 23.01.2017 03:00 - 04:00 | 1400 | 0 | 0 | 0 |
| 23.01.2017 04:00 - 05:00 | 1400 | 0 | 0 | 0 |
| 23.01.2017 05:00 - 06:00 | 1400 | 0 | 0 | 0 |
| 23.01.2017 06:00 - 07:00 | 0 | 0 | 0 | 0 |
| 23.01.2017 07:00 - 08:00 | 0 | 0 | 0 | 0 |
| 23.01.2017 08:00 - 09:00 | 0 | 0 | 0 | 0 |
| 23.01.2017 09:00 - 10:00 | 0 | 0 | 0 | 0 |
| 23.01.2017 10:00 - 11:00 | 0 | 0 | 0 | 0 |
| 23.01.2017 11:00 - 12:00 | 0 | 0 | 0 | 0 |
| 23.01.2017 12:00 - 13:00 | 0 | 0 | 0 | 0 |
| 23.01.2017 13:00 - 14:00 | 0 | 0 | 0 | 0 |
| 23.01.2017 14:00 - 15:00 | 0 | 0 | 0 | 0 |
| 23.01.2017 15:00 - 16:00 | 300 | 0 | 0 | 0 |
| 23.01.2017 16:00 - 17:00 | 300 | 0 | 0 | 0 |
| 23.01.2017 17:00 - 18:00 | 800 | 0 | 0 | 0 |
| 23.01.2017 18:00 - 19:00 | 800 | 0 | 0 | 0 |
| 23.01.2017 19:00 - 20:00 | 1200 | 0 | 0 | 0 |
| 23.01.2017 20:00 - 21:00 | 1200 | 0 | 0 | 0 |
| 23.01.2017 21:00 - 22:00 | 1200 | 0 | 0 | 0 |
| 23.01.2017 22:00 - 23:00 | 1200 | 0 | 0 | 0 |
| 23.01.2017 23:00 - 24:00 | 1495 | 0 | 0 | 0 |
| 24.01.2017 00:00 - 01:00 | 1795 | 0 | 0 | 0 |
| 24.01.2017 01:00 - 02:00 | 1795 | 0 | 0 | 0 |
| 24.01.2017 02:00 - 03:00 | 1795 | 0 | 0 | 0 |
| 24.01.2017 03:00 - 04:00 | 1795 | 0 | 0 | 0 |
| 24.01.2017 04:00 - 05:00 | 1795 | 0 | 0 | 0 |
| 24.01.2017 05:00 - 06:00 | 1795 | 0 | 0 | 0 |
| 24.01.2017 06:00 - 07:00 | 400 | 0 | 0 | 0 |
| 24.01.2017 07:00 - 08:00 | 400 | 0 | 0 | 0 |
| 24.01.2017 08:00 - 09:00 | 400 | 0 | 0 | 0 |
| 24.01.2017 09:00 - 10:00 | 400 | 0 | 0 | 0 |
| 24.01.2017 10:00 - 11:00 | 400 | 0 | 0 | 0 |
| 24.01.2017 11:00 - 12:00 | 400 | 0 | 0 | 0 |
| 24.01.2017 12:00 - 13:00 | 400 | 0 | 0 | 0 |
| 24.01.2017 13:00 - 14:00 | 400 | 0 | 0 | 0 |
| 24.01.2017 14:00 - 15:00 | 400 | 0 | 0 | 0 |
| 24.01.2017 15:00 - 16:00 | 400 | 0 | 0 | 0 |
| 24.01.2017 16:00 - 17:00 | 800 | 0 | 0 | 0 |
| 24.01.2017 17:00 - 18:00 | 800 | 0 | 0 | 0 |
| 24.01.2017 18:00 - 19:00 | 800 | 0 | 0 | 0 |
| 24.01.2017 19:00 - 20:00 | 800 | 0 | 0 | 0 |
| 24.01.2017 20:00 - 21:00 | 800 | 0 | 0 | 0 |
| 24.01.2017 21:00 - 22:00 | 1440 | 0 | 0 | 0 |
| 24.01.2017 22:00 - 23:00 | 1440 | 0 | 0 | 0 |
| 24.01.2017 23:00 - 24:00 | 1440 | 0 | 0 | 0 |
| 25.01.2017 00:00 - 01:00 | 1440 | 0 | 0 | 0 |
| 25.01.2017 01:00 - 02:00 | 1440 | 0 | 0 | 0 |
| 25.01.2017 02:00 - 03:00 | 1440 | 0 | 0 | 0 |
| 25.01.2017 03:00 - 04:00 | 1440 | 0 | 0 | 0 |
| 25.01.2017 04:00 - 05:00 | 1440 | 0 | 0 | 0 |
| 25.01.2017 05:00 - 06:00 | 1440 | 0 | 0 | 0 |
| 25.01.2017 06:00 - 07:00 | 0 | 0 | 0 | 0 |
| 25.01.2017 07:00 - 08:00 | 0 | 0 | 0 | 0 |
| 25.01.2017 08:00 - 09:00 | 0 | 0 | 0 | 0 |
| 25.01.2017 09:00 - 10:00 | 0 | 0 | 0 | 0 |
| 25.01.2017 10:00 - 11:00 | 0 | 0 | 0 | 0 |
| 25.01.2017 11:00 - 12:00 | 0 | 0 | 0 | 0 |
| 25.01.2017 12:00 - 13:00 | 0 | 0 | 0 | 0 |
| 25.01.2017 13:00 - 14:00 | 0 | 0 | 0 | 0 |
| 25.01.2017 14:00 - 15:00 | 0 | 0 | 0 | 0 |
| 25.01.2017 15:00 - 16:00 | 0 | 0 | 0 | 0 |
| 25.01.2017 16:00 - 17:00 | 0 | 0 | 0 | 0 |
| 25.01.2017 17:00 - 18:00 | 0 | 0 | 0 | 0 |
| 25.01.2017 18:00 - 19:00 | 0 | 0 | 0 | 0 |
| 25.01.2017 19:00 - 20:00 | 0 | 0 | 0 | 0 |
| 25.01.2017 20:00 - 21:00 | 0 | 0 | 0 | 0 |
| 25.01.2017 21:00 - 22:00 | 0 | 0 | 0 | 0 |
| 25.01.2017 22:00 - 23:00 | 0 | 0 | 0 | 0 |
| 25.01.2017 23:00 - 24:00 | 0 | 0 | 0 | 0 |
| 26.01.2017 00:00 - 01:00 | 0 | 0 | 0 | 0 |
| 26.01.2017 01:00 - 02:00 | 0 | 0 | 0 | 0 |
| 26.01.2017 02:00 - 03:00 | 0 | 0 | 0 | 0 |
| 26.01.2017 03:00 - 04:00 | 0 | 0 | 0 | 0 |
| 26.01.2017 04:00 - 05:00 | 0 | 0 | 0 | 0 |
| 26.01.2017 05:00 - 06:00 | 0 | 0 | 0 | 0 |
| 26.01.2017 06:00 - 07:00 | 0 | 0 | 0 | 0 |
| 26.01.2017 07:00 - 08:00 | 0 | 0 | 0 | 0 |
| 26.01.2017 08:00 - 09:00 | 0 | 0 | 0 | 0 |
| 26.01.2017 09:00 - 10:00 | 0 | 0 | 0 | 0 |
| 26.01.2017 10:00 - 11:00 | 0 | 0 | 0 | 0 |
| 26.01.2017 11:00 - 12:00 | 0 | 0 | 0 | 0 |
| 26.01.2017 12:00 - 13:00 | 0 | 0 | 0 | 0 |
| 26.01.2017 13:00 - 14:00 | 0 | 0 | 0 | 0 |
| 26.01.2017 14:00 - 15:00 | 0 | 0 | 0 | 0 |
| 26.01.2017 15:00 - 16:00 | 0 | 0 | 0 | 0 |
| 26.01.2017 16:00 - 17:00 | 0 | 0 | 0 | 0 |
| 26.01.2017 17:00 - 18:00 | 0 | 0 | 0 | 0 |
| 26.01.2017 18:00 - 19:00 | 0 | 0 | 0 | 0 |
| 26.01.2017 19:00 - 20:00 | 0 | 0 | 0 | 0 |
| 26.01.2017 20:00 - 21:00 | 0 | 0 | 0 | 0 |
| 26.01.2017 21:00 - 22:00 | 0 | 0 | 0 | 0 |
| 26.01.2017 22:00 - 23:00 | 0 | 0 | 0 | 0 |
| 26.01.2017 23:00 - 24:00 | 0 | 0 | 0 | 0 |
| 27.01.2017 00:00 - 01:00 | 0 | 0 | 0 | 0 |
| 27.01.2017 01:00 - 02:00 | 0 | 0 | 0 | 0 |
| 27.01.2017 02:00 - 03:00 | 0 | 0 | 0 | 0 |
| 27.01.2017 03:00 - 04:00 | 0 | 0 | 0 | 0 |
| 27.01.2017 04:00 - 05:00 | 0 | 0 | 0 | 0 |
| 27.01.2017 05:00 - 06:00 | 0 | 0 | 0 | 0 |
| 27.01.2017 06:00 - 07:00 | 0 | 0 | 0 | 0 |
| 27.01.2017 07:00 - 08:00 | 0 | 0 | 0 | 0 |
| 27.01.2017 08:00 - 09:00 | 0 | 0 | 0 | 0 |
| 27.01.2017 09:00 - 10:00 | 0 | 0 | 0 | 0 |
| 27.01.2017 10:00 - 11:00 | 0 | 0 | 0 | 0 |
| 27.01.2017 11:00 - 12:00 | 0 | 0 | 0 | 0 |
| 27.01.2017 12:00 - 13:00 | 0 | 0 | 0 | 0 |
| 27.01.2017 13:00 - 14:00 | 0 | 0 | 0 | 0 |
| 27.01.2017 14:00 - 15:00 | 0 | 0 | 0 | 0 |
| 27.01.2017 15:00 - 16:00 | 0 | 0 | 0 | 0 |
| 27.01.2017 16:00 - 17:00 | 0 | 0 | 0 | 0 |
| 27.01.2017 17:00 - 18:00 | 0 | 0 | 0 | 0 |
| 27.01.2017 18:00 - 19:00 | 0 | 0 | 0 | 0 |
| 27.01.2017 19:00 - 20:00 | 0 | 0 | 0 | 0 |
| 27.01.2017 20:00 - 21:00 | 0 | 0 | 0 | 0 |
| 27.01.2017 21:00 - 22:00 | 0 | 0 | 0 | 0 |
| 27.01.2017 22:00 - 23:00 | 0 | 0 | 0 | 0 |
| 27.01.2017 23:00 - 24:00 | 300 | 0 | 0 | 0 |
| 28.01.2017 00:00 - 01:00 | 300 | 0 | 0 | 0 |
| 28.01.2017 01:00 - 02:00 | 300 | 0 | 0 | 0 |
| 28.01.2017 02:00 - 03:00 | 300 | 0 | 0 | 0 |
| 28.01.2017 03:00 - 04:00 | 300 | 0 | 0 | 0 |
| 28.01.2017 04:00 - 05:00 | 300 | 0 | 0 | 0 |
| 28.01.2017 05:00 - 06:00 | 300 | 0 | 0 | 0 |
| 28.01.2017 06:00 - 07:00 | 0 | 0 | 0 | 0 |
| 28.01.2017 07:00 - 08:00 | 0 | 0 | 0 | 0 |
| 28.01.2017 08:00 - 09:00 | 0 | 0 | 0 | 0 |
| 28.01.2017 09:00 - 10:00 | 0 | 0 | 0 | 0 |
| 28.01.2017 10:00 - 11:00 | 0 | 0 | 0 | 0 |
| 28.01.2017 11:00 - 12:00 | 0 | 0 | 0 | 0 |
| 28.01.2017 12:00 - 13:00 | 0 | 0 | 0 | 0 |
| 28.01.2017 13:00 - 14:00 | 0 | 0 | 0 | 0 |
| 28.01.2017 14:00 - 15:00 | 0 | 0 | 0 | 0 |
| 28.01.2017 15:00 - 16:00 | 0 | 0 | 0 | 0 |
| 28.01.2017 16:00 - 17:00 | 0 | 0 | 0 | 0 |
| 28.01.2017 17:00 - 18:00 | 0 | 0 | 0 | 0 |
| 28.01.2017 18:00 - 19:00 | 0 | 0 | 0 | 0 |
| 28.01.2017 19:00 - 20:00 | 0 | 0 | 0 | 0 |
| 28.01.2017 20:00 - 21:00 | 0 | 0 | 0 | 0 |
| 28.01.2017 21:00 - 22:00 | 0 | 0 | 0 | 0 |
| 28.01.2017 22:00 - 23:00 | 0 | 0 | 0 | 0 |
| 28.01.2017 23:00 - 24:00 | 0 | 0 | 0 | 0 |
| 29.01.2017 00:00 - 01:00 | 0 | 0 | 0 | 0 |
| 29.01.2017 01:00 - 02:00 | 0 | 0 | 0 | 0 |
| 29.01.2017 02:00 - 03:00 | 0 | 0 | 0 | 0 |
| 29.01.2017 03:00 - 04:00 | 0 | 0 | 0 | 0 |
| 29.01.2017 04:00 - 05:00 | 0 | 0 | 0 | 0 |
| 29.01.2017 05:00 - 06:00 | 0 | 0 | 0 | 0 |
| 29.01.2017 06:00 - 07:00 | 0 | 0 | 0 | 0 |
| 29.01.2017 07:00 - 08:00 | 0 | 0 | 0 | 0 |
| 29.01.2017 08:00 - 09:00 | 0 | 0 | 0 | 0 |
| 29.01.2017 09:00 - 10:00 | 0 | 0 | 0 | 0 |
| 29.01.2017 10:00 - 11:00 | 0 | 0 | 0 | 0 |
| 29.01.2017 11:00 - 12:00 | 0 | 0 | 0 | 0 |
| 29.01.2017 12:00 - 13:00 | 0 | 0 | 0 | 0 |
| 29.01.2017 13:00 - 14:00 | 0 | 0 | 0 | 0 |
| 29.01.2017 14:00 - 15:00 | 0 | 0 | 0 | 0 |
| 29.01.2017 15:00 - 16:00 | 0 | 0 | 0 | 0 |
| 29.01.2017 16:00 - 17:00 | 0 | 0 | 0 | 0 |
| 29.01.2017 17:00 - 18:00 | 500 | 0 | 0 | 0 |
| 29.01.2017 18:00 - 19:00 | 500 | 0 | 0 | 0 |
| 29.01.2017 19:00 - 20:00 | 1242 | 0 | 0 | 0 |
| 29.01.2017 20:00 - 21:00 | 1242 | 0 | 0 | 0 |
| 29.01.2017 21:00 - 22:00 | 1242 | 0 | 0 | 0 |
| 29.01.2017 22:00 - 23:00 | 1242 | 0 | 0 | 0 |
| 29.01.2017 23:00 - 24:00 | 1242 | 0 | 0 | 0 |
| 30.01.2017 00:00 - 01:00 | 1942 | 0 | 0 | 0 |
| 30.01.2017 01:00 - 02:00 | 1942 | 0 | 0 | 0 |
| 30.01.2017 02:00 - 03:00 | 1942 | 0 | 0 | 0 |
| 30.01.2017 03:00 - 04:00 | 1942 | 0 | 0 | 0 |
| 30.01.2017 04:00 - 05:00 | 1942 | 0 | 0 | 0 |
| 30.01.2017 05:00 - 06:00 | 1942 | 0 | 0 | 0 |
| 30.01.2017 06:00 - 07:00 | 288 | 0 | 0 | 0 |
| 30.01.2017 07:00 - 08:00 | 288 | 0 | 0 | 0 |
| 30.01.2017 08:00 - 09:00 | 288 | 0 | 0 | 0 |
| 30.01.2017 09:00 - 10:00 | 288 | 0 | 0 | 0 |
| 30.01.2017 10:00 - 11:00 | 488 | 0 | 0 | 0 |
| 30.01.2017 11:00 - 12:00 | 488 | 0 | 0 | 0 |
| 30.01.2017 12:00 - 13:00 | 488 | 0 | 0 | 0 |
| 30.01.2017 13:00 - 14:00 | 888 | 0 | 0 | 0 |
| 30.01.2017 14:00 - 15:00 | 888 | 0 | 0 | 0 |
| 30.01.2017 15:00 - 16:00 | 888 | 0 | 0 | 0 |
| 30.01.2017 16:00 - 17:00 | 1188 | 0 | 0 | 0 |
| 30.01.2017 17:00 - 18:00 | 1188 | 0 | 0 | 0 |
| 30.01.2017 18:00 - 19:00 | 1188 | 0 | 0 | 0 |
| 30.01.2017 19:00 - 20:00 | 1188 | 0 | 0 | 0 |
| 30.01.2017 20:00 - 21:00 | 1188 | 0 | 0 | 0 |
| 30.01.2017 21:00 - 22:00 | 1188 | 0 | 0 | 0 |
| 30.01.2017 22:00 - 23:00 | 1188 | 0 | 0 | 0 |
| 30.01.2017 23:00 - 24:00 | 1188 | 0 | 0 | 0 |
| 31.01.2017 00:00 - 01:00 | 1188 | 0 | 0 | 0 |
| 31.01.2017 01:00 - 02:00 | 1188 | 0 | 0 | 0 |
| 31.01.2017 02:00 - 03:00 | 1188 | 0 | 0 | 0 |
| 31.01.2017 03:00 - 04:00 | 1188 | 0 | 0 | 0 |
| 31.01.2017 04:00 - 05:00 | 1188 | 0 | 0 | 0 |
| 31.01.2017 05:00 - 06:00 | 1188 | 0 | 0 | 0 |
| 31.01.2017 06:00 - 07:00 | 0 | 0 | 0 | 0 |
| 31.01.2017 07:00 - 08:00 | 0 | 0 | 0 | 0 |
| 31.01.2017 08:00 - 09:00 | 500 | 0 | 0 | 0 |
| 31.01.2017 09:00 - 10:00 | 500 | 0 | 0 | 0 |
| 31.01.2017 10:00 - 11:00 | 500 | 0 | 0 | 0 |
| 31.01.2017 11:00 - 12:00 | 650 | 0 | 0 | 0 |
| 31.01.2017 12:00 - 13:00 | 650 | 0 | 0 | 0 |
| 31.01.2017 13:00 - 14:00 | 650 | 0 | 0 | 0 |
| 31.01.2017 14:00 - 15:00 | 850 | 0 | 0 | 0 |
| 31.01.2017 15:00 - 16:00 | 850 | 0 | 0 | 0 |
| 31.01.2017 16:00 - 17:00 | 850 | 0 | 0 | 0 |
| 31.01.2017 17:00 - 18:00 | 850 | 0 | 0 | 0 |
| 31.01.2017 18:00 - 19:00 | 850 | 0 | 0 | 0 |
| 31.01.2017 19:00 - 20:00 | 850 | 0 | 0 | 0 |
| 31.01.2017 20:00 - 21:00 | 850 | 0 | 0 | 0 |
| 31.01.2017 21:00 - 22:00 | 850 | 0 | 0 | 0 |
| 31.01.2017 22:00 - 23:00 | 850 | 0 | 0 | 0 |
| 31.01.2017 23:00 - 24:00 | 850 | 0 | 0 | 0 |
| 01.02.2017 00:00 - 01:00 | 1450 | 0 | 0 | 0 |
| 01.02.2017 01:00 - 02:00 | 1450 | 0 | 0 | 0 |
| 01.02.2017 02:00 - 03:00 | 1450 | 0 | 0 | 0 |
| 01.02.2017 03:00 - 04:00 | 1450 | 0 | 0 | 0 |
| 01.02.2017 04:00 - 05:00 | 1450 | 0 | 0 | 0 |
| 01.02.2017 05:00 - 06:00 | 1450 | 0 | 0 | 0 |